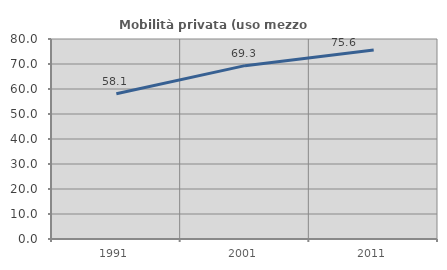
| Category | Mobilità privata (uso mezzo privato) |
|---|---|
| 1991.0 | 58.065 |
| 2001.0 | 69.339 |
| 2011.0 | 75.616 |